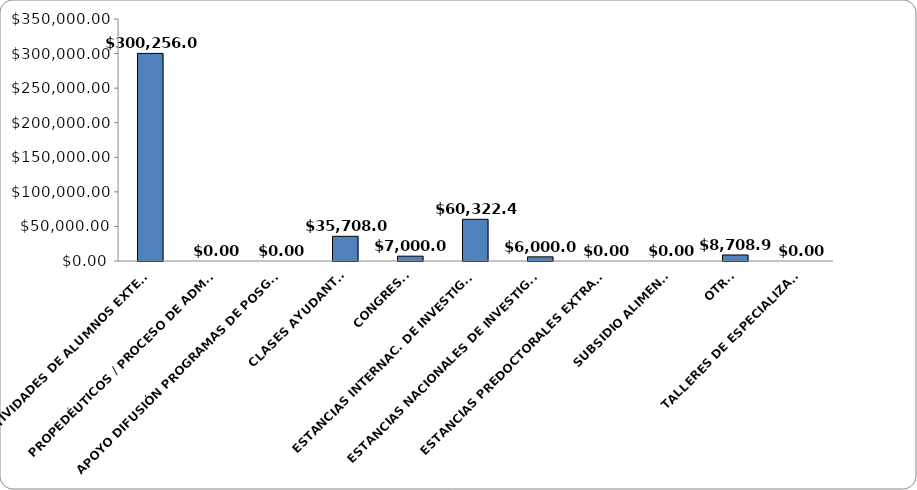
| Category | Series 0 |
|---|---|
| ACTIVIDADES DE ALUMNOS EXTERNOS | 300256 |
| PROPEDÉUTICOS / PROCESO DE ADMISIÓN | 0 |
| APOYO DIFUSIÓN PROGRAMAS DE POSGRADO | 0 |
| CLASES AYUDANTÍAS | 35708.04 |
| CONGRESOS | 7000 |
| ESTANCIAS INTERNAC. DE INVESTIGACIÓN | 60322.41 |
| ESTANCIAS NACIONALES DE INVESTIGACIÓN | 6000 |
| ESTANCIAS PREDOCTORALES EXTRANJERO | 0 |
| SUBSIDIO ALIMENTOS | 0 |
| OTROS | 8708.91 |
| TALLERES DE ESPECIALIZACIÓN | 0 |